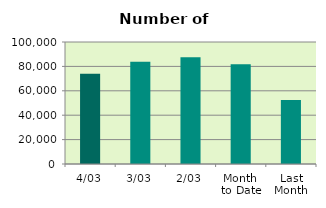
| Category | Series 0 |
|---|---|
| 4/03 | 74070 |
| 3/03 | 83814 |
| 2/03 | 87582 |
| Month 
to Date | 81822 |
| Last
Month | 52501.6 |